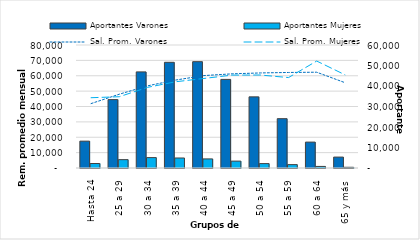
| Category | Aportantes Varones | Aportantes Mujeres |
|---|---|---|
| Hasta 24 | 13097 | 2189 |
| 25 a 29 | 33361 | 4077 |
| 30 a 34 | 46885 | 5070 |
| 35 a 39 | 51559 | 4885 |
| 40 a 44 | 51868 | 4435 |
| 45 a 49 | 43224 | 3361 |
| 50 a 54 | 34706 | 2148 |
| 55 a 59 | 24055 | 1651 |
| 60 a 64 | 12637 | 766 |
| 65 y más | 5327 | 349 |